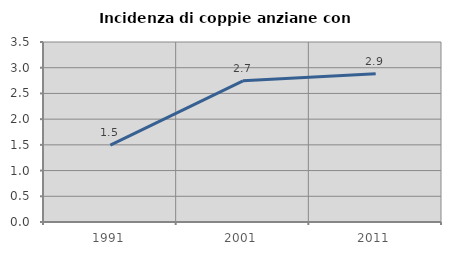
| Category | Incidenza di coppie anziane con figli |
|---|---|
| 1991.0 | 1.494 |
| 2001.0 | 2.746 |
| 2011.0 | 2.881 |